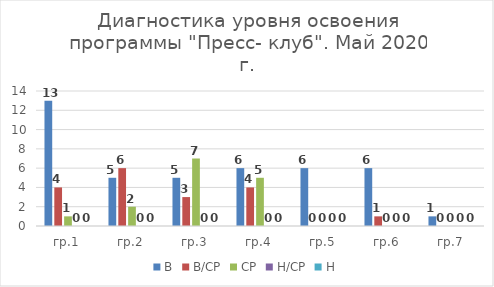
| Category | В | В/СР | СР | Н/СР | Н |
|---|---|---|---|---|---|
| гр.1 | 13 | 4 | 1 | 0 | 0 |
| гр.2 | 5 | 6 | 2 | 0 | 0 |
| гр.3 | 5 | 3 | 7 | 0 | 0 |
| гр.4 | 6 | 4 | 5 | 0 | 0 |
| гр.5 | 6 | 0 | 0 | 0 | 0 |
| гр.6 | 6 | 1 | 0 | 0 | 0 |
| гр.7 | 1 | 0 | 0 | 0 | 0 |